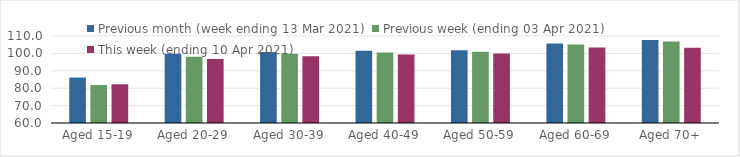
| Category | Previous month (week ending 13 Mar 2021) | Previous week (ending 03 Apr 2021) | This week (ending 10 Apr 2021) |
|---|---|---|---|
| Aged 15-19 | 86.12 | 81.8 | 82.24 |
| Aged 20-29 | 99.79 | 98.14 | 96.75 |
| Aged 30-39 | 100.77 | 99.79 | 98.42 |
| Aged 40-49 | 101.48 | 100.51 | 99.33 |
| Aged 50-59 | 101.86 | 101.02 | 99.92 |
| Aged 60-69 | 105.65 | 105.1 | 103.34 |
| Aged 70+ | 107.76 | 106.83 | 103.24 |